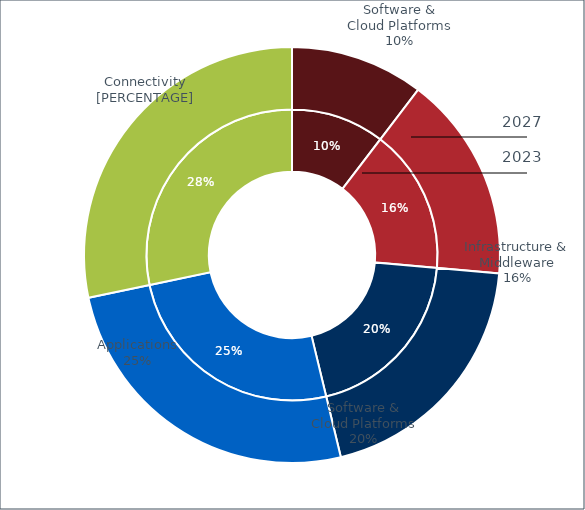
| Category | Series 0 | Series 1 |
|---|---|---|
| 0 | 1863.4 | 2728.204 |
| 1 | 2879.8 | 4216.315 |
| 2 | 3557.4 | 5208.389 |
| 3 | 4573.8 | 6696.501 |
| 4 | 5082 | 7440.556 |